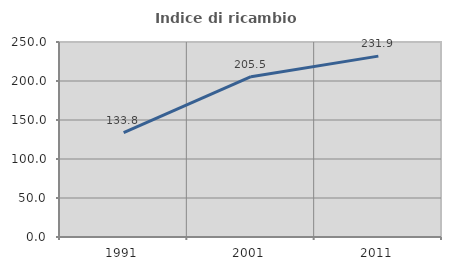
| Category | Indice di ricambio occupazionale  |
|---|---|
| 1991.0 | 133.784 |
| 2001.0 | 205.479 |
| 2011.0 | 231.868 |